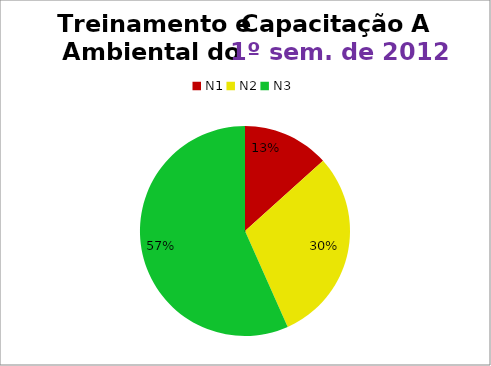
| Category | 1º/12 |
|---|---|
| N1 | 4 |
| N2 | 9 |
| N3 | 17 |